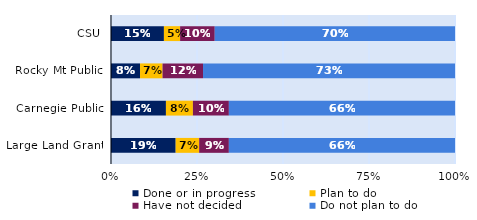
| Category | Done or in progress | Plan to do | Have not decided | Do not plan to do |
|---|---|---|---|---|
| CSU | 0.154 | 0.047 | 0.101 | 0.698 |
| Rocky Mt Public | 0.084 | 0.065 | 0.118 | 0.733 |
| Carnegie Public | 0.16 | 0.078 | 0.105 | 0.657 |
| Large Land Grant | 0.188 | 0.068 | 0.086 | 0.657 |